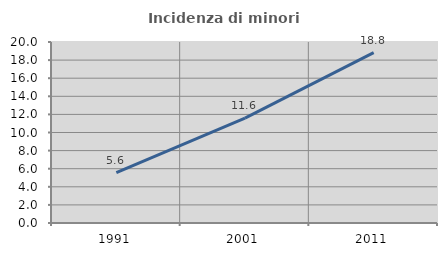
| Category | Incidenza di minori stranieri |
|---|---|
| 1991.0 | 5.556 |
| 2001.0 | 11.594 |
| 2011.0 | 18.827 |